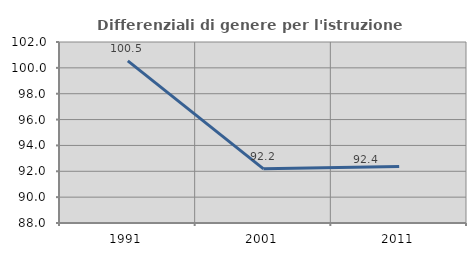
| Category | Differenziali di genere per l'istruzione superiore |
|---|---|
| 1991.0 | 100.54 |
| 2001.0 | 92.191 |
| 2011.0 | 92.376 |